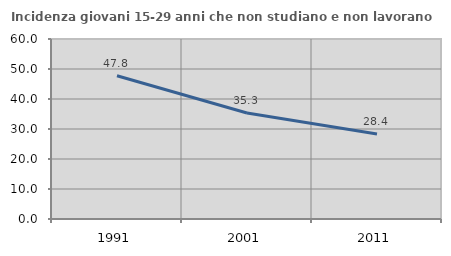
| Category | Incidenza giovani 15-29 anni che non studiano e non lavorano  |
|---|---|
| 1991.0 | 47.751 |
| 2001.0 | 35.314 |
| 2011.0 | 28.362 |